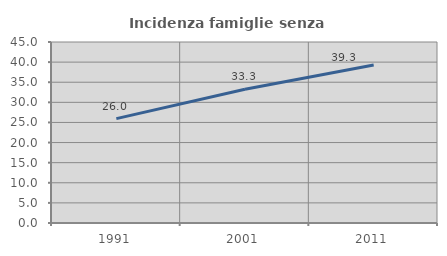
| Category | Incidenza famiglie senza nuclei |
|---|---|
| 1991.0 | 25.952 |
| 2001.0 | 33.26 |
| 2011.0 | 39.286 |